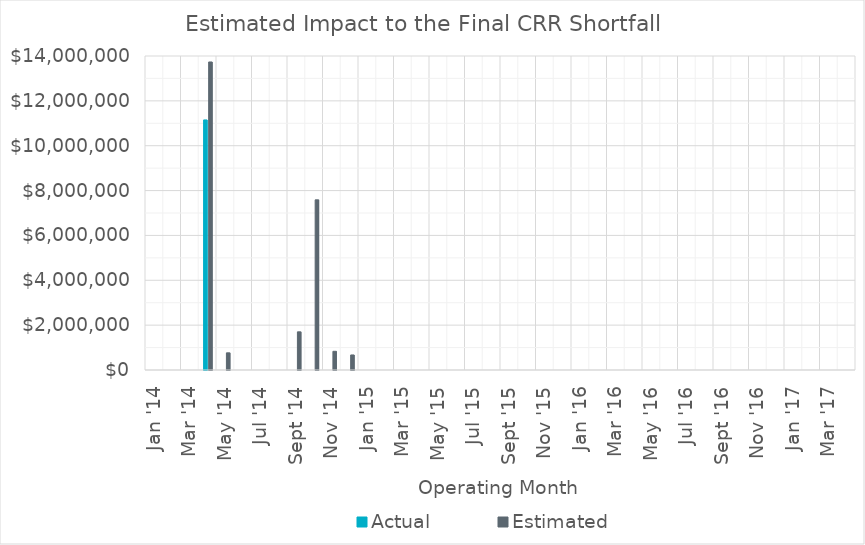
| Category | Actual | Estimated |
|---|---|---|
| 2014-01-01 | 0 | 0 |
| 2014-02-01 | 0 | 0 |
| 2014-03-01 | 0 | 0 |
| 2014-04-01 | 11149733.64 | 13733265.326 |
| 2014-05-01 | 0 | 765081.016 |
| 2014-06-01 | 0 | 0 |
| 2014-07-01 | 0 | 0 |
| 2014-08-01 | 0 | 0 |
| 2014-09-01 | 0 | 1701265.288 |
| 2014-10-01 | 0 | 7585481.073 |
| 2014-11-01 | 0 | 833664.093 |
| 2014-12-01 | 0 | 670341.199 |
| 2015-01-01 | 0 | 0 |
| 2015-02-01 | 0 | 0 |
| 2015-03-01 | 0 | 0 |
| 2015-04-01 | 0 | 0 |
| 2015-05-01 | 0 | 0 |
| 2015-06-01 | 0 | 0 |
| 2015-07-01 | 0 | 0 |
| 2015-08-01 | 0 | 0 |
| 2015-09-01 | 0 | 0 |
| 2015-10-01 | 0 | 0 |
| 2015-11-01 | 0 | 0 |
| 2015-12-01 | 0 | 0 |
| 2016-01-01 | 0 | 0 |
| 2016-02-01 | 0 | 0 |
| 2016-03-01 | 0 | 0 |
| 2016-04-01 | 0 | 0 |
| 2016-05-01 | 0 | 0 |
| 2016-06-01 | 0 | 0 |
| 2016-07-01 | 0 | 0 |
| 2016-08-01 | 0 | 0 |
| 2016-09-01 | 0 | 0 |
| 2016-10-01 | 0 | 0 |
| 2016-11-01 | 0 | 0 |
| 2016-12-01 | 0 | 0 |
| 2017-01-01 | 0 | 0 |
| 2017-02-01 | 0 | 0 |
| 2017-03-01 | 0 | 0 |
| 2017-04-01 | 0 | 0 |